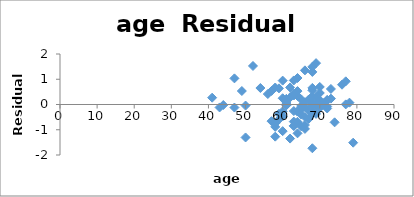
| Category | Series 0 |
|---|---|
| 50.0 | -1.305 |
| 58.0 | -0.887 |
| 74.0 | -0.706 |
| 58.0 | -0.747 |
| 62.0 | -1.35 |
| 50.0 | -0.042 |
| 64.0 | -1.141 |
| 58.0 | -1.273 |
| 47.0 | -0.12 |
| 63.0 | -0.259 |
| 65.0 | -0.182 |
| 63.0 | 0.437 |
| 63.0 | -0.853 |
| 67.0 | -0.572 |
| 57.0 | -0.659 |
| 66.0 | -0.491 |
| 70.0 | 0.173 |
| 66.0 | -0.966 |
| 41.0 | 0.27 |
| 70.0 | -0.135 |
| 59.0 | -0.368 |
| 60.0 | -1.055 |
| 59.0 | 0.639 |
| 63.0 | -0.843 |
| 69.0 | -0.064 |
| 68.0 | -0.286 |
| 65.0 | -0.153 |
| 67.0 | 0.194 |
| 67.0 | -0.235 |
| 65.0 | -0.399 |
| 65.0 | -0.06 |
| 65.0 | -0.867 |
| 71.0 | 0.051 |
| 54.0 | 0.653 |
| 63.0 | 0.953 |
| 64.0 | -0.685 |
| 73.0 | 0.232 |
| 64.0 | 1.05 |
| 68.0 | -1.733 |
| 56.0 | 0.414 |
| 60.0 | 0.248 |
| 68.0 | 0.094 |
| 62.0 | 0.277 |
| 61.0 | -0.017 |
| 66.0 | 0.087 |
| 61.0 | -0.033 |
| 79.0 | -1.512 |
| 68.0 | -0.008 |
| 43.0 | -0.117 |
| 70.0 | 0.456 |
| 68.0 | 0.327 |
| 64.0 | -0.273 |
| 64.0 | 0.532 |
| 68.0 | -0.298 |
| 59.0 | -0.592 |
| 66.0 | -0.101 |
| 47.0 | 1.035 |
| 49.0 | 0.535 |
| 70.0 | 0.695 |
| 61.0 | 0.186 |
| 73.0 | 0.615 |
| 63.0 | -0.677 |
| 72.0 | -0.157 |
| 66.0 | -0.812 |
| 64.0 | 0.337 |
| 61.0 | 0.223 |
| 68.0 | -0.048 |
| 72.0 | -0.078 |
| 69.0 | 1.638 |
| 72.0 | 0.172 |
| 60.0 | -0.271 |
| 77.0 | 0.918 |
| 69.0 | 0.29 |
| 60.0 | -0.469 |
| 69.0 | -0.372 |
| 68.0 | -0.371 |
| 72.0 | 0.18 |
| 78.0 | 0.073 |
| 69.0 | -0.017 |
| 63.0 | 0.357 |
| 66.0 | 1.352 |
| 57.0 | 0.538 |
| 77.0 | 0.004 |
| 65.0 | 0.204 |
| 60.0 | 0.946 |
| 64.0 | -0.279 |
| 58.0 | 0.673 |
| 62.0 | 0.675 |
| 65.0 | -0.146 |
| 76.0 | 0.784 |
| 68.0 | 0.657 |
| 61.0 | 0.059 |
| 68.0 | 0.562 |
| 44.0 | -0.021 |
| 52.0 | 1.526 |
| 68.0 | 1.29 |
| 68.0 | 1.491 |